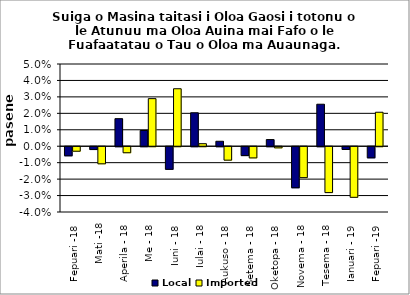
| Category | Local | Imported |
|---|---|---|
| Fepuari -18 | -0.006 | -0.003 |
| Mati -18 | -0.002 | -0.01 |
| Aperila - 18 | 0.017 | -0.004 |
| Me - 18 | 0.01 | 0.029 |
| Iuni - 18 | -0.014 | 0.035 |
| Iulai - 18 | 0.02 | 0.002 |
| Aukuso - 18 | 0.003 | -0.008 |
| Setema - 18 | -0.005 | -0.007 |
| Oketopa - 18 | 0.004 | -0.001 |
| Novema - 18 | -0.025 | -0.019 |
| Tesema - 18 | 0.026 | -0.028 |
| Ianuari - 19 | -0.002 | -0.031 |
| Fepuari -19 | -0.007 | 0.021 |